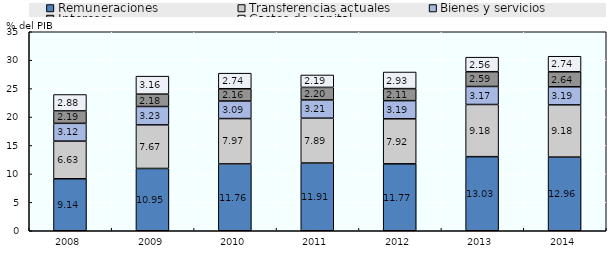
| Category | Remuneraciones | Transferencias actuales | Bienes y servicios | Intereses | Gastos de capital |
|---|---|---|---|---|---|
| 2008.0 | 9.144 | 6.625 | 3.123 | 2.189 | 2.884 |
| 2009.0 | 10.954 | 7.666 | 3.235 | 2.177 | 3.16 |
| 2010.0 | 11.758 | 7.975 | 3.086 | 2.158 | 2.739 |
| 2011.0 | 11.913 | 7.886 | 3.21 | 2.203 | 2.188 |
| 2012.0 | 11.773 | 7.918 | 3.194 | 2.113 | 2.926 |
| 2013.0 | 13.031 | 9.176 | 3.171 | 2.595 | 2.557 |
| 2014.0 | 12.956 | 9.18 | 3.185 | 2.637 | 2.738 |